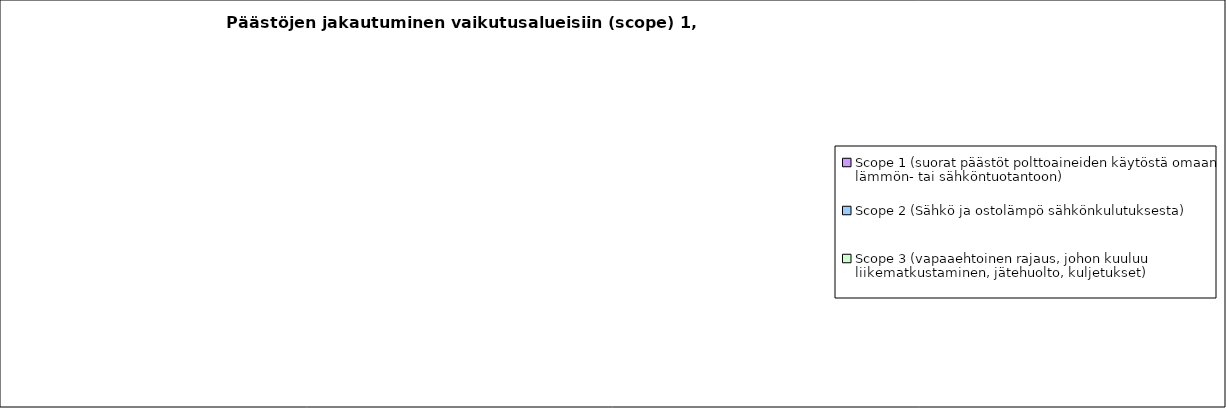
| Category | Series 0 |
|---|---|
| Scope 1 (suorat päästöt polttoaineiden käytöstä omaan lämmön- tai sähköntuotantoon) | 0 |
| Scope 2 (Sähkö ja ostolämpö sähkönkulutuksesta) | 0 |
| Scope 3 (vapaaehtoinen rajaus, johon kuuluu liikematkustaminen, jätehuolto, kuljetukset) | 0 |